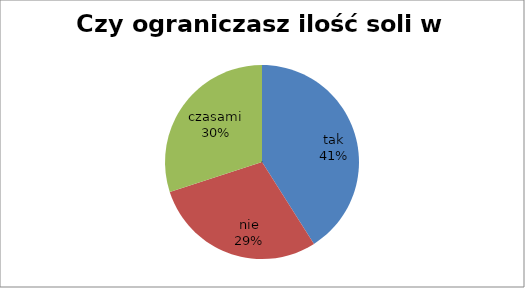
| Category | Czy ograniczasz ilość soli w potrawach? |
|---|---|
| tak | 41 |
| nie | 29 |
| czasami | 30 |